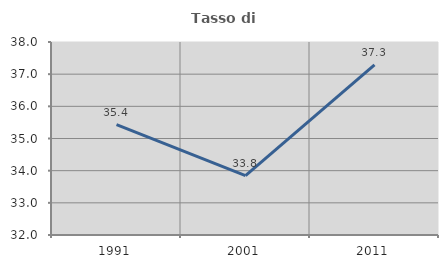
| Category | Tasso di occupazione   |
|---|---|
| 1991.0 | 35.433 |
| 2001.0 | 33.846 |
| 2011.0 | 37.288 |